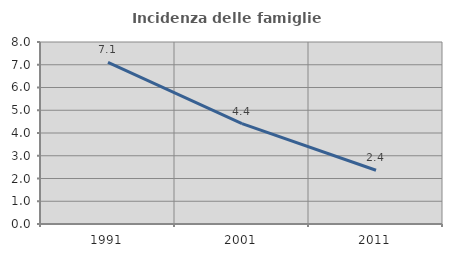
| Category | Incidenza delle famiglie numerose |
|---|---|
| 1991.0 | 7.105 |
| 2001.0 | 4.415 |
| 2011.0 | 2.364 |